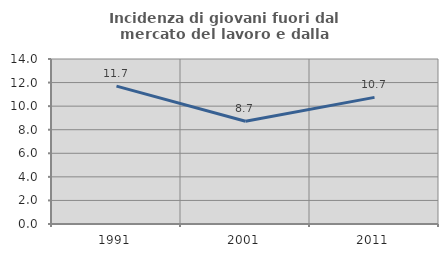
| Category | Incidenza di giovani fuori dal mercato del lavoro e dalla formazione  |
|---|---|
| 1991.0 | 11.696 |
| 2001.0 | 8.721 |
| 2011.0 | 10.744 |